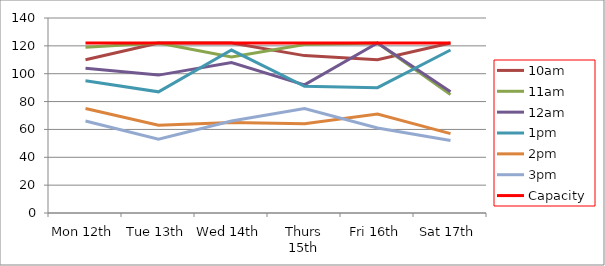
| Category | 9am | 10am | 11am | 12am | 1pm | 2pm | 3pm | 4pm | 5pm | Capacity |
|---|---|---|---|---|---|---|---|---|---|---|
| Mon 12th |  | 110 | 119 | 104 | 95 | 75 | 66 |  |  | 122 |
| Tue 13th |  | 122 | 122 | 99 | 87 | 63 | 53 |  |  | 122 |
| Wed 14th |  | 122 | 112 | 108 | 117 | 65 | 66 |  |  | 122 |
| Thurs 15th |  | 113 | 121 | 92 | 91 | 64 | 75 |  |  | 122 |
| Fri 16th |  | 110 | 122 | 122 | 90 | 71 | 61 |  |  | 122 |
| Sat 17th |  | 122 | 85 | 87 | 117 | 57 | 52 |  |  | 122 |